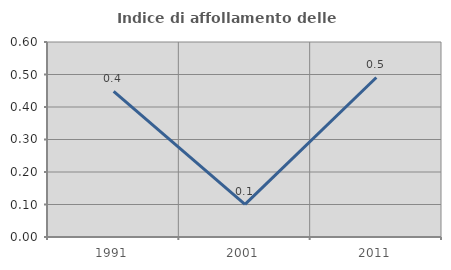
| Category | Indice di affollamento delle abitazioni  |
|---|---|
| 1991.0 | 0.448 |
| 2001.0 | 0.1 |
| 2011.0 | 0.491 |